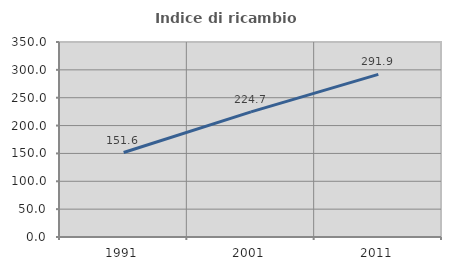
| Category | Indice di ricambio occupazionale  |
|---|---|
| 1991.0 | 151.592 |
| 2001.0 | 224.658 |
| 2011.0 | 291.892 |